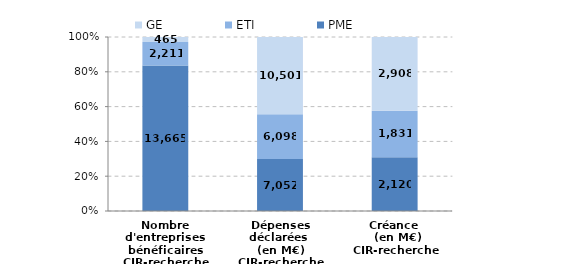
| Category | PME | ETI | GE |
|---|---|---|---|
| Nombre d'entreprises bénéficaires
CIR-recherche | 13665 | 2211 | 465 |
| Dépenses déclarées 
(en M€)
CIR-recherche | 7052.43 | 6098.04 | 10501.48 |
| Créance 
 (en M€)
CIR-recherche | 2120.25 | 1831.2 | 2908.02 |